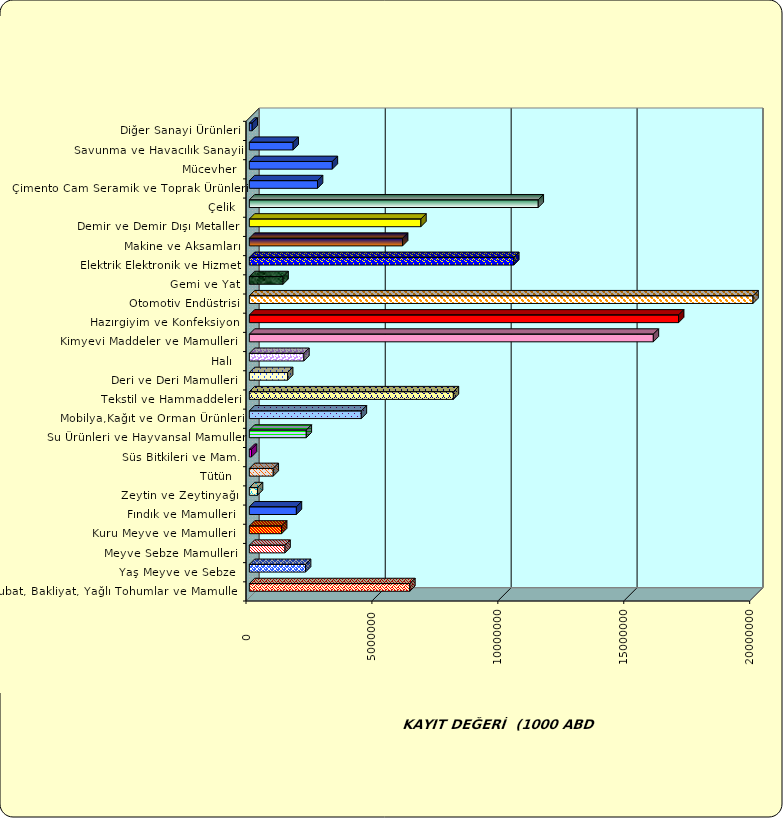
| Category | Series 0 |
|---|---|
|  Hububat, Bakliyat, Yağlı Tohumlar ve Mamulleri  | 6372511.972 |
|  Yaş Meyve ve Sebze   | 2231391.383 |
|  Meyve Sebze Mamulleri  | 1416697.659 |
|  Kuru Meyve ve Mamulleri   | 1282238.486 |
|  Fındık ve Mamulleri  | 1868308.706 |
|  Zeytin ve Zeytinyağı  | 323075.795 |
|  Tütün  | 948665.355 |
|  Süs Bitkileri ve Mam. | 84808.206 |
|  Su Ürünleri ve Hayvansal Mamuller | 2260996.231 |
|  Mobilya,Kağıt ve Orman Ürünleri | 4446395.621 |
|  Tekstil ve Hammaddeleri | 8101820.874 |
|  Deri ve Deri Mamulleri  | 1519231.482 |
|  Halı  | 2165688.862 |
|  Kimyevi Maddeler ve Mamulleri   | 16042218.116 |
|  Hazırgiyim ve Konfeksiyon  | 17045360.344 |
|  Otomotiv Endüstrisi | 28534556.33 |
|  Gemi ve Yat | 1338158.413 |
|  Elektrik Elektronik ve Hizmet | 10500495.429 |
|  Makine ve Aksamları | 6085453.423 |
|  Demir ve Demir Dışı Metaller  | 6812164.26 |
|  Çelik | 11471943.541 |
|  Çimento Cam Seramik ve Toprak Ürünleri | 2706819.712 |
|  Mücevher | 3295816.59 |
|  Savunma ve Havacılık Sanayii | 1739452.711 |
|  Diğer Sanayi Ürünleri | 112244.901 |